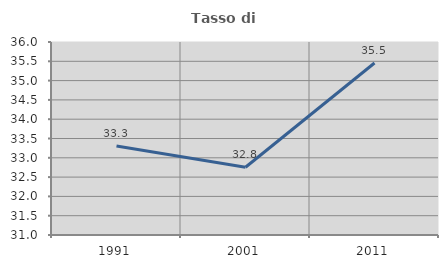
| Category | Tasso di occupazione   |
|---|---|
| 1991.0 | 33.303 |
| 2001.0 | 32.756 |
| 2011.0 | 35.456 |